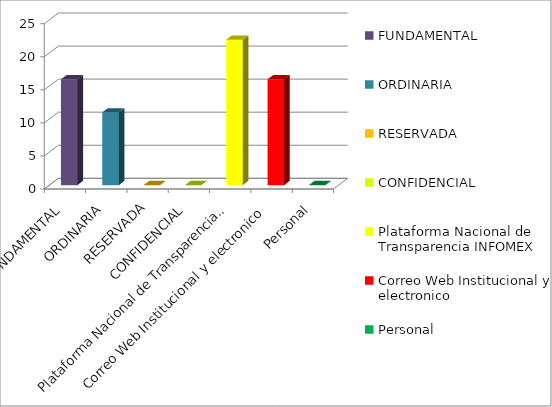
| Category | Series 2 |
|---|---|
| FUNDAMENTAL | 16 |
| ORDINARIA | 11 |
| RESERVADA | 0 |
| CONFIDENCIAL | 0 |
| Plataforma Nacional de Transparencia INFOMEX | 22 |
| Correo Web Institucional y electronico | 16 |
| Personal | 0 |